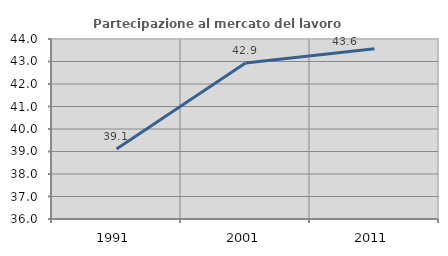
| Category | Partecipazione al mercato del lavoro  femminile |
|---|---|
| 1991.0 | 39.11 |
| 2001.0 | 42.936 |
| 2011.0 | 43.568 |